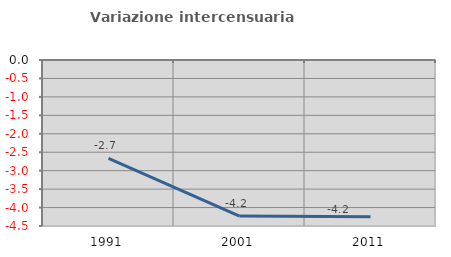
| Category | Variazione intercensuaria annua |
|---|---|
| 1991.0 | -2.666 |
| 2001.0 | -4.231 |
| 2011.0 | -4.249 |